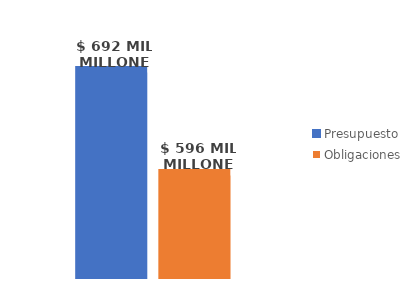
| Category | Presupuesto | Obligaciones |
|---|---|---|
| Total | 691633994335.13 | 595647056630.816 |